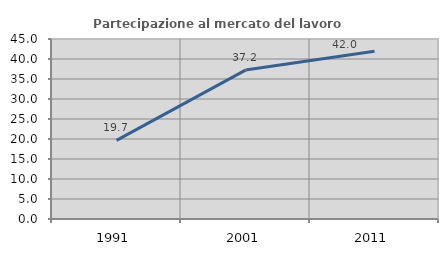
| Category | Partecipazione al mercato del lavoro  femminile |
|---|---|
| 1991.0 | 19.658 |
| 2001.0 | 37.226 |
| 2011.0 | 41.958 |